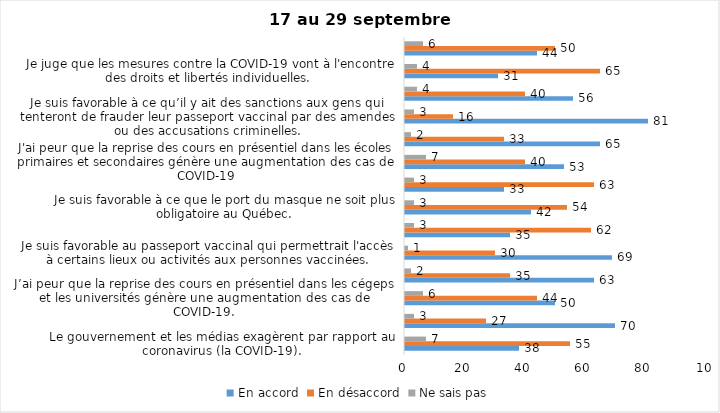
| Category | En accord | En désaccord | Ne sais pas |
|---|---|---|---|
| Le gouvernement et les médias exagèrent par rapport au coronavirus (la COVID-19). | 38 | 55 | 7 |
| J’ai peur que le système de santé soit débordé par les cas de COVID-19. | 70 | 27 | 3 |
| J’ai peur que la reprise des cours en présentiel dans les cégeps et les universités génère une augmentation des cas de COVID-19. | 50 | 44 | 6 |
| Je suis inquiet/inquiète  que le nombre de cas augmente en raison des nouveaux variants du virus de la COVID-19 | 63 | 35 | 2 |
| Je suis favorable au passeport vaccinal qui permettrait l'accès à certains lieux ou activités aux personnes vaccinées. | 69 | 30 | 1 |
| Si les cas de COVID-19 augmentent cet automne, je suis favorable à la mise en place de mesures de confinement (ex. fermeture de services non essentiels, interdiction des rassemblements privés) | 35 | 62 | 3 |
| Je suis favorable à ce que le port du masque ne soit plus obligatoire au Québec. | 42 | 54 | 3 |
| Étant donné la progression de la vaccination, je pense qu’il est moins important de suivre les mesures de prévention. | 33 | 63 | 3 |
| J'ai peur que la reprise des cours en présentiel dans les écoles primaires et secondaires génère une augmentation des cas de COVID-19 | 53 | 40 | 7 |
| Je suis favorable à ce qu’il y ait des sanctions aux commerçants qui ne vérifieront pas le passeport vaccinal (code QR) de leurs clients | 65 | 33 | 2 |
| Je suis favorable à ce qu’il y ait des sanctions aux gens qui tenteront de frauder leur passeport vaccinal par des amendes ou des accusations criminelles. | 81 | 16 | 3 |
| Je crois que le passeport vaccinal devrait être requis pour davantage de services et commerces (ex. : spas, centre d’achats, centre de soins personnels. | 56 | 40 | 4 |
| Je juge que les mesures contre la COVID-19 vont à l'encontre des droits et libertés individuelles.  | 31 | 65 | 4 |
| Je pense que le gouvernement du Québec devrait mettre fin à l’état d’urgence sanitaire.  | 44 | 50 | 6 |